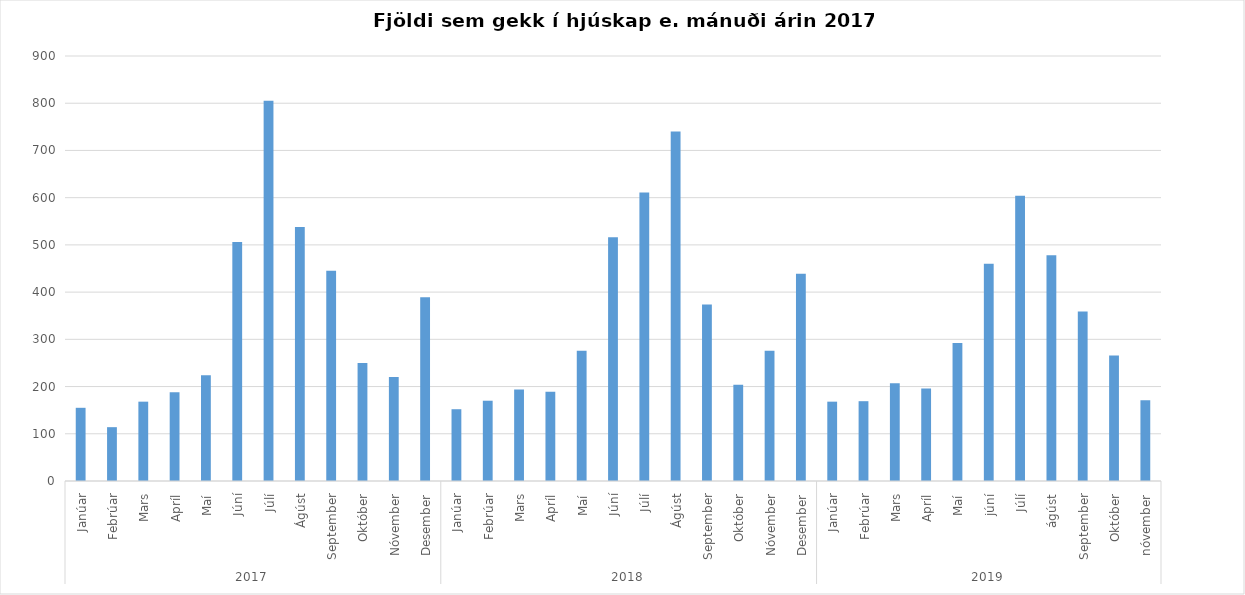
| Category | Series 0 |
|---|---|
| 0 | 155 |
| 1 | 114 |
| 2 | 168 |
| 3 | 188 |
| 4 | 224 |
| 5 | 506 |
| 6 | 805 |
| 7 | 538 |
| 8 | 445 |
| 9 | 250 |
| 10 | 220 |
| 11 | 389 |
| 12 | 152 |
| 13 | 170 |
| 14 | 194 |
| 15 | 189 |
| 16 | 276 |
| 17 | 516 |
| 18 | 611 |
| 19 | 740 |
| 20 | 374 |
| 21 | 204 |
| 22 | 276 |
| 23 | 439 |
| 24 | 168 |
| 25 | 169 |
| 26 | 207 |
| 27 | 196 |
| 28 | 292 |
| 29 | 460 |
| 30 | 604 |
| 31 | 478 |
| 32 | 359 |
| 33 | 266 |
| 34 | 171 |